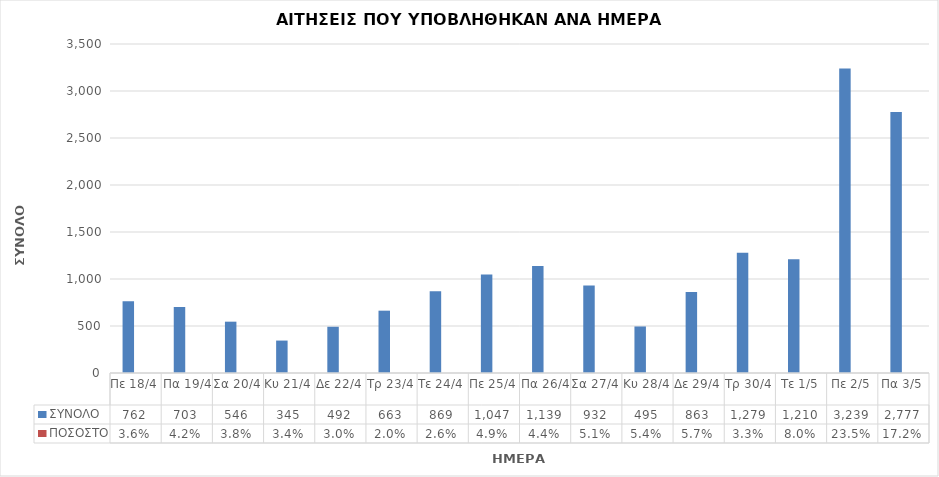
| Category | ΣΥΝΟΛΟ | ΠΟΣΟΣΤΟ |
|---|---|---|
| Πε 18/4 | 762 | 0.036 |
| Πα 19/4 | 703 | 0.042 |
| Σα 20/4 | 546 | 0.038 |
| Κυ 21/4 | 345 | 0.034 |
| Δε 22/4 | 492 | 0.03 |
| Τρ 23/4 | 663 | 0.02 |
| Τε 24/4 | 869 | 0.026 |
| Πε 25/4 | 1047 | 0.049 |
| Πα 26/4 | 1139 | 0.044 |
| Σα 27/4 | 932 | 0.051 |
| Κυ 28/4 | 495 | 0.054 |
| Δε 29/4 | 863 | 0.057 |
| Τρ 30/4 | 1279 | 0.033 |
| Τε 1/5 | 1210 | 0.08 |
| Πε 2/5 | 3239 | 0.235 |
| Πα 3/5 | 2777 | 0.172 |